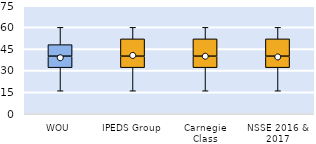
| Category | 25th | 50th | 75th |
|---|---|---|---|
| WOU | 32 | 8 | 8 |
| IPEDS Group | 32 | 8 | 12 |
| Carnegie Class | 32 | 8 | 12 |
| NSSE 2016 & 2017 | 32 | 8 | 12 |